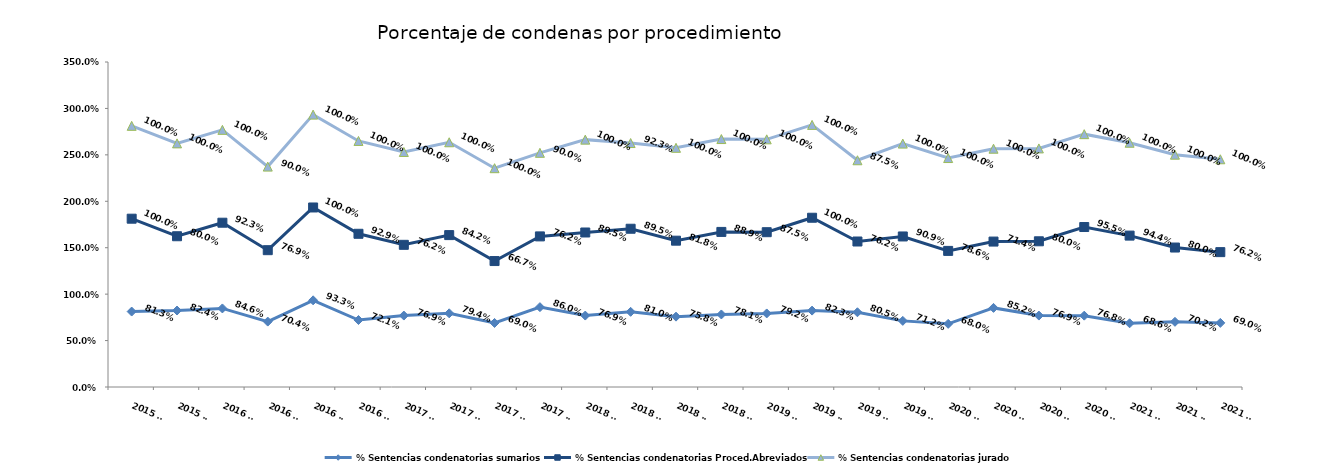
| Category | % Sentencias condenatorias sumarios | % Sentencias condenatorias Proced.Abreviados | % Sentencias condenatorias jurado |
|---|---|---|---|
| 2015 T3 | 0.812 | 1 | 1 |
| 2015 T4 | 0.824 | 0.8 | 1 |
| 2016 T1 | 0.846 | 0.923 | 1 |
| 2016 T2 | 0.704 | 0.769 | 0.9 |
| 2016 T3 | 0.933 | 1 | 1 |
| 2016 T4 | 0.721 | 0.929 | 1 |
| 2017 T1 | 0.769 | 0.762 | 1 |
| 2017 T2 | 0.794 | 0.842 | 1 |
| 2017 T3 | 0.69 | 0.667 | 1 |
| 2017 T4 | 0.86 | 0.762 | 0.9 |
| 2018 T1 | 0.769 | 0.895 | 1 |
| 2018 T2 | 0.81 | 0.895 | 0.923 |
| 2018 T3 | 0.758 | 0.818 | 1 |
| 2018 T4 | 0.781 | 0.889 | 1 |
| 2019 T1 | 0.792 | 0.875 | 1 |
| 2019 T2 | 0.823 | 1 | 1 |
| 2019 T3 | 0.805 | 0.762 | 0.875 |
| 2019 T4 | 0.712 | 0.909 | 1 |
| 2020 T1 | 0.68 | 0.786 | 1 |
| 2020 T2 | 0.852 | 0.714 | 1 |
| 2020 T3 | 0.769 | 0.8 | 1 |
| 2020 T4 | 0.768 | 0.955 | 1 |
| 2021 T1 | 0.686 | 0.944 | 1 |
| 2021 T2 | 0.702 | 0.8 | 1 |
| 2021 T3 | 0.69 | 0.762 | 1 |